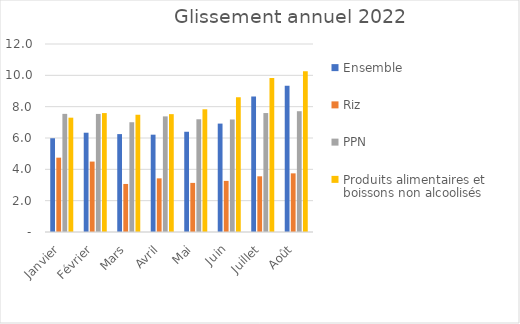
| Category | Ensemble | Riz | PPN | Produits alimentaires et boissons non alcoolisés |
|---|---|---|---|---|
| Janvier | 5.984 | 4.745 | 7.54 | 7.297 |
| Février | 6.337 | 4.495 | 7.537 | 7.591 |
| Mars | 6.249 | 3.066 | 7.006 | 7.484 |
| Avril | 6.212 | 3.424 | 7.38 | 7.523 |
| Mai | 6.399 | 3.134 | 7.195 | 7.832 |
| Juin | 6.919 | 3.263 | 7.182 | 8.599 |
| Juillet | 8.653 | 3.555 | 7.593 | 9.833 |
| Août | 9.327 | 3.744 | 7.709 | 10.254 |